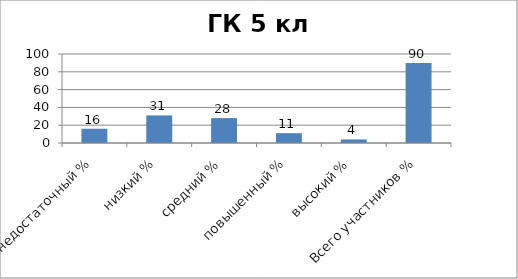
| Category | Series 0 |
|---|---|
| недостаточный % | 16 |
| низкий % | 31 |
| средний % | 28 |
| повышенный % | 11 |
| высокий % | 4 |
| Всего участников % | 90 |